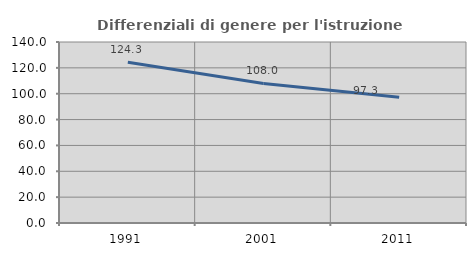
| Category | Differenziali di genere per l'istruzione superiore |
|---|---|
| 1991.0 | 124.292 |
| 2001.0 | 107.974 |
| 2011.0 | 97.346 |